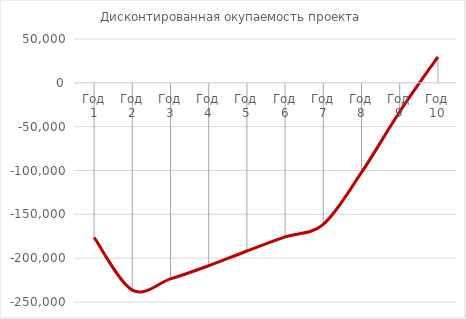
| Category | Дисконтированная окупаемость проекта |
|---|---|
| Год 1 | -176400 |
| Год 2 | -236444.705 |
| Год 3 | -223701.126 |
| Год 4 | -208633.168 |
| Год 5 | -191828.99 |
| Год 6 | -175768.417 |
| Год 7 | -161369.76 |
| Год 8 | -102232.559 |
| Год 9 | -32957.53 |
| Год 10 | 29654.936 |